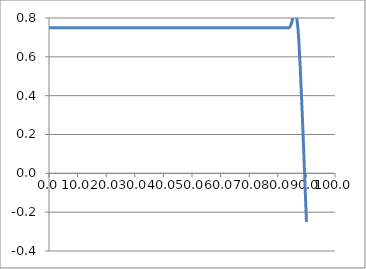
| Category | Elevation (in.) |
|---|---|
| 0.024 | 0.75 |
| 3.024 | 0.75 |
| 6.024 | 0.75 |
| 9.024000000000001 | 0.75 |
| 12.024000000000001 | 0.75 |
| 15.024000000000001 | 0.75 |
| 18.024 | 0.75 |
| 21.024 | 0.75 |
| 24.023999999999997 | 0.75 |
| 27.023999999999997 | 0.75 |
| 30.023999999999997 | 0.75 |
| 33.024 | 0.75 |
| 36.024 | 0.75 |
| 39.024 | 0.75 |
| 42.024 | 0.75 |
| 45.024 | 0.75 |
| 48.024 | 0.75 |
| 51.024 | 0.75 |
| 54.024 | 0.75 |
| 57.024 | 0.75 |
| 60.024 | 0.75 |
| 63.024 | 0.75 |
| 66.024 | 0.75 |
| 69.024 | 0.75 |
| 72.024 | 0.75 |
| 75.024 | 0.75 |
| 78.024 | 0.75 |
| 81.024 | 0.75 |
| 84.024 | 0.75 |
| 87.024 | 0.75 |
| 90.024 | -0.25 |